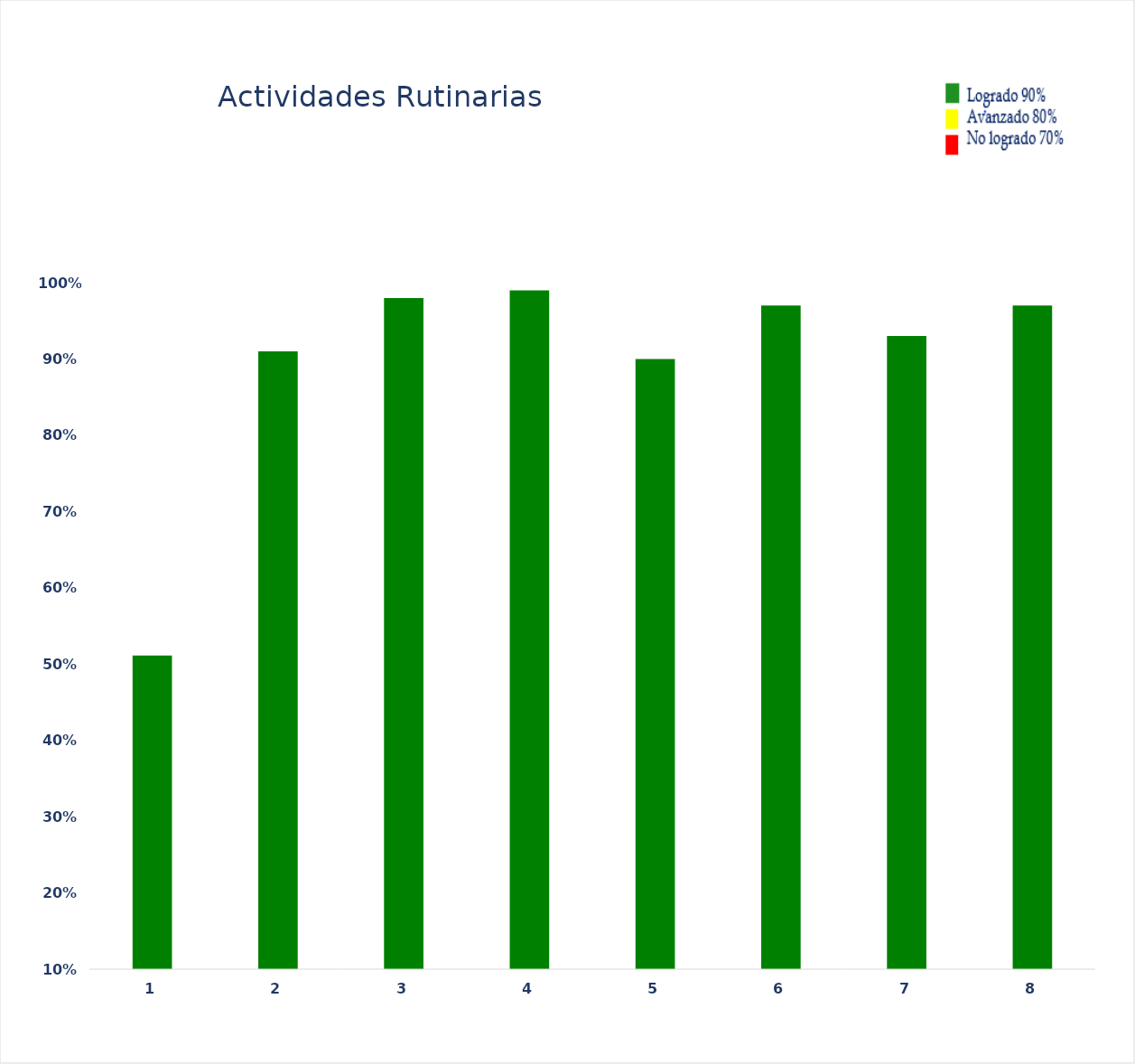
| Category | Series 0 |
|---|---|
| 0 | 0.511 |
| 1 | 0.91 |
| 2 | 0.98 |
| 3 | 0.99 |
| 4 | 0.9 |
| 5 | 0.97 |
| 6 | 0.93 |
| 7 | 0.97 |